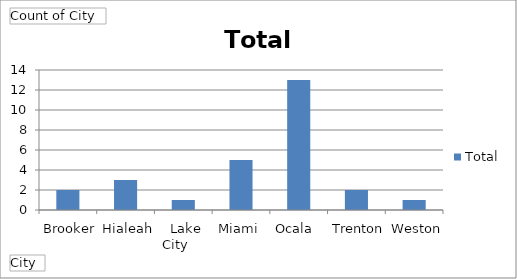
| Category | Total |
|---|---|
|  Brooker       | 2 |
|  Hialeah       | 3 |
|  Lake City     | 1 |
|  Miami         | 5 |
|  Ocala         | 13 |
|  Trenton       | 2 |
|  Weston        | 1 |